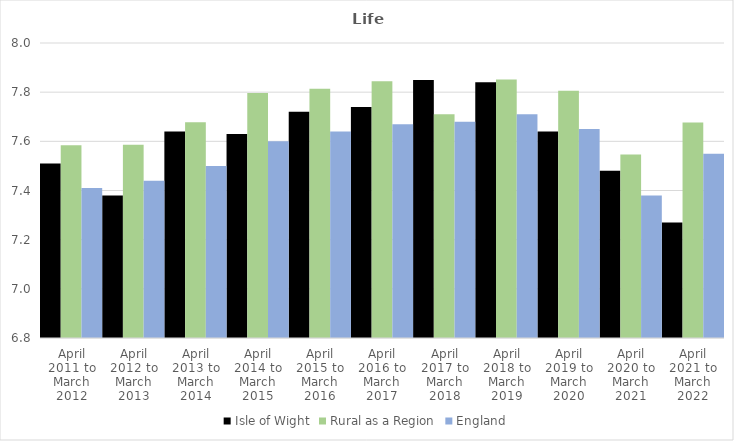
| Category | Isle of Wight | Rural as a Region | England |
|---|---|---|---|
| April 2011 to March 2012 | 7.51 | 7.584 | 7.41 |
| April 2012 to March 2013 | 7.38 | 7.586 | 7.44 |
| April 2013 to March 2014 | 7.64 | 7.677 | 7.5 |
| April 2014 to March 2015 | 7.63 | 7.797 | 7.6 |
| April 2015 to March 2016 | 7.72 | 7.813 | 7.64 |
| April 2016 to March 2017 | 7.74 | 7.845 | 7.67 |
| April 2017 to March 2018 | 7.85 | 7.71 | 7.68 |
| April 2018 to March 2019 | 7.84 | 7.852 | 7.71 |
| April 2019 to March 2020 | 7.64 | 7.806 | 7.65 |
| April 2020 to March 2021 | 7.48 | 7.546 | 7.38 |
| April 2021 to March 2022 | 7.27 | 7.677 | 7.55 |